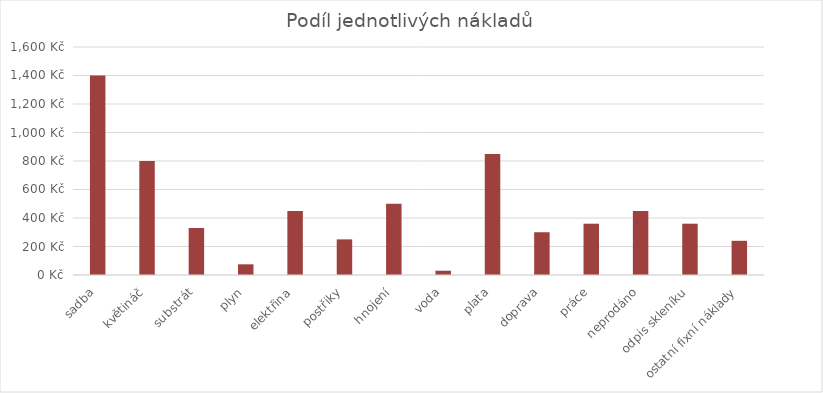
| Category | Series 2 |
|---|---|
| sadba | 1400 |
| květináč | 800 |
| substrát | 330 |
| plyn | 75 |
| elektřina | 450 |
| postřiky | 250 |
| hnojení | 500 |
| voda | 30 |
| plata | 850 |
| doprava | 300 |
| práce | 360 |
| neprodáno | 450 |
| odpis skleníku | 360 |
| ostatní fixní náklady | 240 |